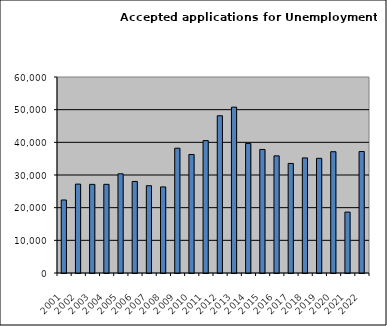
| Category | Series 1 | Series 0 |
|---|---|---|
| 2001.0 | 22351 |  |
| 2002.0 | 27207 |  |
| 2003.0 | 27131 |  |
| 2004.0 | 27142 |  |
| 2005.0 | 30362 |  |
| 2006.0 | 28022 |  |
| 2007.0 | 26717 |  |
| 2008.0 | 26348 |  |
| 2009.0 | 38201 |  |
| 2010.0 | 36278 |  |
| 2011.0 | 40529 |  |
| 2012.0 | 48137 |  |
| 2013.0 | 50768 |  |
| 2014.0 | 39674 |  |
| 2015.0 | 37824 |  |
| 2016.0 | 35859 |  |
| 2017.0 | 33535 |  |
| 2018.0 | 35226 |  |
| 2019.0 | 35107 |  |
| 2020.0 | 37127 |  |
| 2021.0 | 18648 |  |
| 2022.0 | 37188 |  |